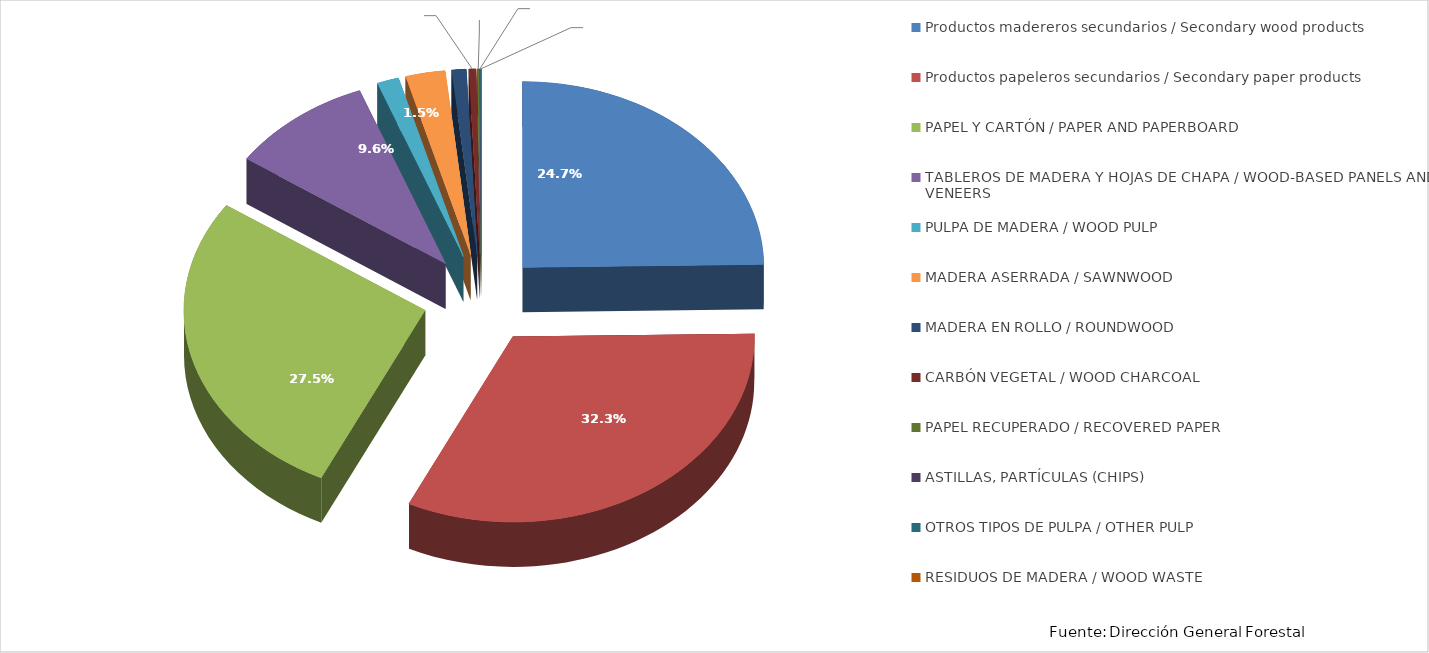
| Category | Series 0 |
|---|---|
| Productos madereros secundarios / Secondary wood products | 78880.121 |
| Productos papeleros secundarios / Secondary paper products | 103089.625 |
| PAPEL Y CARTÓN / PAPER AND PAPERBOARD | 87603.932 |
| TABLEROS DE MADERA Y HOJAS DE CHAPA / WOOD-BASED PANELS AND VENEERS | 30671.3 |
| PULPA DE MADERA / WOOD PULP | 4638.852 |
| MADERA ASERRADA / SAWNWOOD | 8444.437 |
| MADERA EN ROLLO / ROUNDWOOD | 3074.353 |
| CARBÓN VEGETAL / WOOD CHARCOAL | 1521.997 |
| PAPEL RECUPERADO / RECOVERED PAPER | 458.989 |
| ASTILLAS, PARTÍCULAS (CHIPS) | 83.613 |
| OTROS TIPOS DE PULPA / OTHER PULP | 193.722 |
| RESIDUOS DE MADERA / WOOD WASTE | 58.874 |